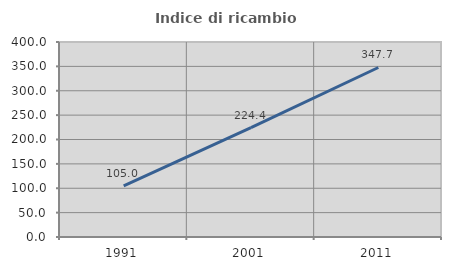
| Category | Indice di ricambio occupazionale  |
|---|---|
| 1991.0 | 105 |
| 2001.0 | 224.444 |
| 2011.0 | 347.727 |